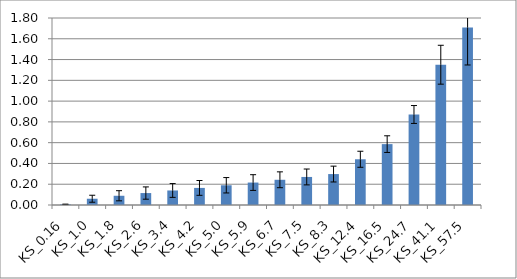
| Category | Roughness |
|---|---|
| KS_0.16 | 0.006 |
| KS_1.0 | 0.06 |
| KS_1.8 | 0.089 |
| KS_2.6 | 0.115 |
| KS_3.4 | 0.14 |
| KS_4.2 | 0.164 |
| KS_5.0 | 0.19 |
| KS_5.9 | 0.216 |
| KS_6.7 | 0.243 |
| KS_7.5 | 0.27 |
| KS_8.3 | 0.298 |
| KS_12.4 | 0.44 |
| KS_16.5 | 0.586 |
| KS_24.7 | 0.871 |
| KS_41.1 | 1.35 |
| KS_57.5 | 1.71 |